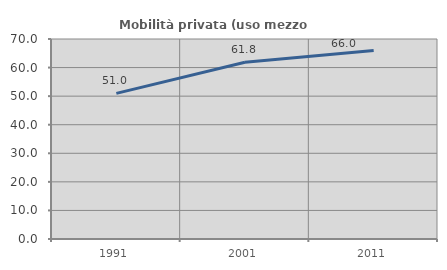
| Category | Mobilità privata (uso mezzo privato) |
|---|---|
| 1991.0 | 50.974 |
| 2001.0 | 61.846 |
| 2011.0 | 65.993 |